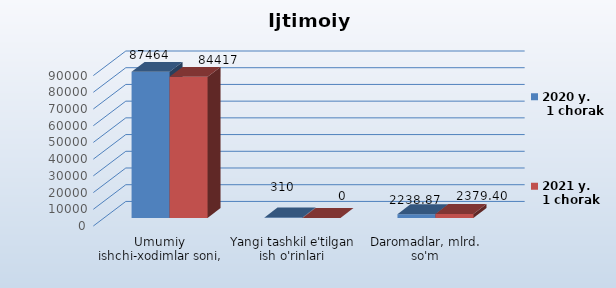
| Category | 2020 y.        1 chorak 
 | 2021 y.       1 chorak
 |
|---|---|---|
| Umumiy ishchi-xodimlar soni, ming odam | 87464 | 84417 |
| Yangi tashkil e'tilgan ish o'rinlari | 310 | 0 |
| Daromadlar, mlrd. so'm | 2238.872 | 2379.4 |